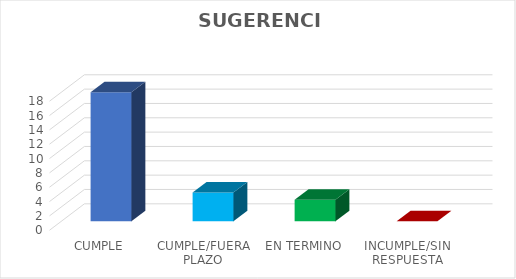
| Category | TOTAL |
|---|---|
| CUMPLE | 18 |
| CUMPLE/FUERA PLAZO | 4 |
| EN TERMINO | 3 |
| INCUMPLE/SIN RESPUESTA | 0 |